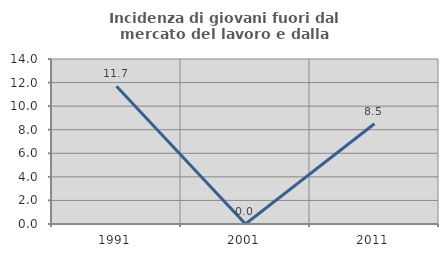
| Category | Incidenza di giovani fuori dal mercato del lavoro e dalla formazione  |
|---|---|
| 1991.0 | 11.688 |
| 2001.0 | 0 |
| 2011.0 | 8.511 |